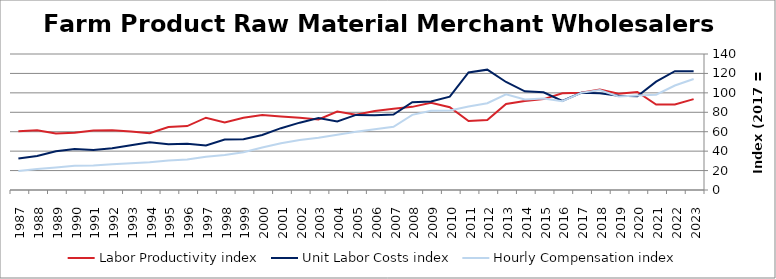
| Category | Labor Productivity index | Unit Labor Costs index | Hourly Compensation index |
|---|---|---|---|
| 2023.0 | 93.546 | 122.131 | 114.249 |
| 2022.0 | 87.983 | 122.29 | 107.595 |
| 2021.0 | 87.921 | 111.512 | 98.043 |
| 2020.0 | 100.888 | 96.453 | 97.309 |
| 2019.0 | 99.193 | 96.942 | 96.159 |
| 2018.0 | 103.332 | 99.499 | 102.814 |
| 2017.0 | 100 | 100 | 100 |
| 2016.0 | 99.642 | 91.696 | 91.368 |
| 2015.0 | 93.559 | 100.542 | 94.066 |
| 2014.0 | 91.655 | 101.629 | 93.148 |
| 2013.0 | 88.537 | 111.175 | 98.431 |
| 2012.0 | 72.135 | 123.883 | 89.364 |
| 2011.0 | 70.948 | 121.003 | 85.85 |
| 2010.0 | 85.258 | 96.093 | 81.927 |
| 2009.0 | 89.693 | 91.055 | 81.67 |
| 2008.0 | 85.583 | 90.399 | 77.366 |
| 2007.0 | 83.739 | 77.696 | 65.061 |
| 2006.0 | 81.293 | 76.852 | 62.475 |
| 2005.0 | 77.547 | 77.282 | 59.93 |
| 2004.0 | 80.726 | 70.464 | 56.883 |
| 2003.0 | 72.63 | 74.114 | 53.829 |
| 2002.0 | 74.366 | 69.318 | 51.55 |
| 2001.0 | 75.775 | 63.639 | 48.223 |
| 2000.0 | 77.243 | 56.582 | 43.705 |
| 1999.0 | 74.389 | 52.328 | 38.926 |
| 1998.0 | 69.437 | 51.899 | 36.037 |
| 1997.0 | 74.429 | 45.841 | 34.119 |
| 1996.0 | 65.837 | 47.58 | 31.325 |
| 1995.0 | 64.762 | 47.058 | 30.476 |
| 1994.0 | 58.381 | 49.032 | 28.625 |
| 1993.0 | 60.13 | 45.98 | 27.647 |
| 1992.0 | 61.533 | 42.92 | 26.41 |
| 1991.0 | 61.219 | 41.267 | 25.263 |
| 1990.0 | 58.97 | 42.214 | 24.893 |
| 1989.0 | 58.206 | 39.879 | 23.212 |
| 1988.0 | 61.426 | 35.035 | 21.521 |
| 1987.0 | 60.582 | 32.389 | 19.622 |